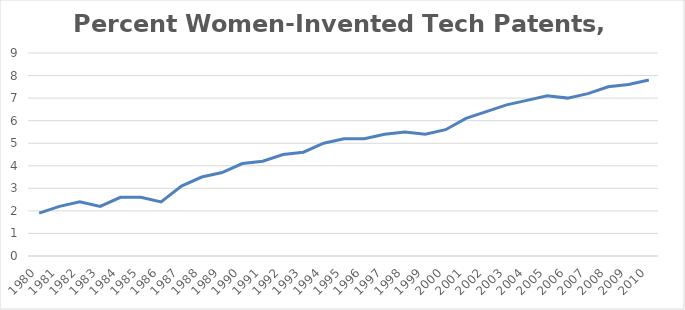
| Category | Percent Female |
|---|---|
| 1980.0 | 1.9 |
| 1981.0 | 2.2 |
| 1982.0 | 2.4 |
| 1983.0 | 2.2 |
| 1984.0 | 2.6 |
| 1985.0 | 2.6 |
| 1986.0 | 2.4 |
| 1987.0 | 3.1 |
| 1988.0 | 3.5 |
| 1989.0 | 3.7 |
| 1990.0 | 4.1 |
| 1991.0 | 4.2 |
| 1992.0 | 4.5 |
| 1993.0 | 4.6 |
| 1994.0 | 5 |
| 1995.0 | 5.2 |
| 1996.0 | 5.2 |
| 1997.0 | 5.4 |
| 1998.0 | 5.5 |
| 1999.0 | 5.4 |
| 2000.0 | 5.6 |
| 2001.0 | 6.1 |
| 2002.0 | 6.4 |
| 2003.0 | 6.7 |
| 2004.0 | 6.9 |
| 2005.0 | 7.1 |
| 2006.0 | 7 |
| 2007.0 | 7.2 |
| 2008.0 | 7.5 |
| 2009.0 | 7.6 |
| 2010.0 | 7.8 |